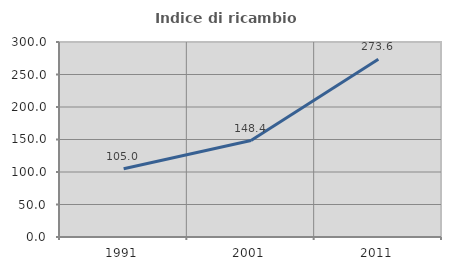
| Category | Indice di ricambio occupazionale  |
|---|---|
| 1991.0 | 105.021 |
| 2001.0 | 148.404 |
| 2011.0 | 273.554 |